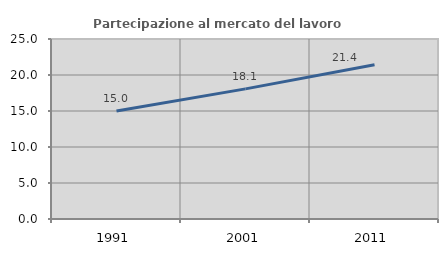
| Category | Partecipazione al mercato del lavoro  femminile |
|---|---|
| 1991.0 | 15 |
| 2001.0 | 18.072 |
| 2011.0 | 21.429 |